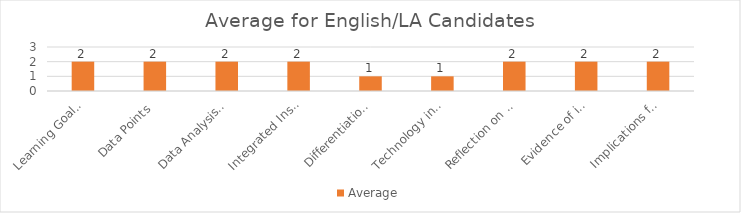
| Category | Average |
|---|---|
| Learning Goals Aligned with Pre-/Post-assessments ACEI 4.0 | 2 |
| Data Points | 2 |
| Data Analysis for Pedagogical Decisions ACEI 4.0 | 2 |
| Integrated Instruction ACEI 3.1 | 2 |
| Differentiation based on knowledge of individual learning ACEI 3.2 | 1 |
| Technology integration | 1 |
| Reflection on pedagogical decisions ACEI 1.0 | 2 |
| Evidence of impact on student learning ACEI 5.1 | 2 |
| Implications for teaching and professional development ACEI 5.1 | 2 |